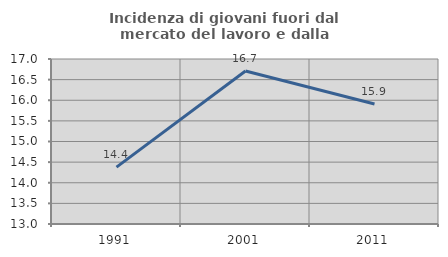
| Category | Incidenza di giovani fuori dal mercato del lavoro e dalla formazione  |
|---|---|
| 1991.0 | 14.378 |
| 2001.0 | 16.71 |
| 2011.0 | 15.909 |